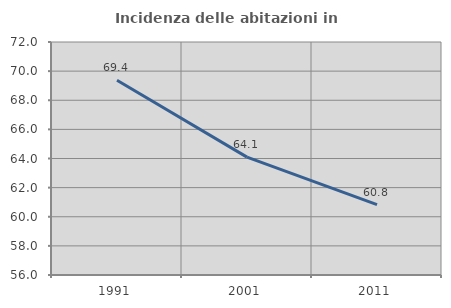
| Category | Incidenza delle abitazioni in proprietà  |
|---|---|
| 1991.0 | 69.371 |
| 2001.0 | 64.097 |
| 2011.0 | 60.833 |